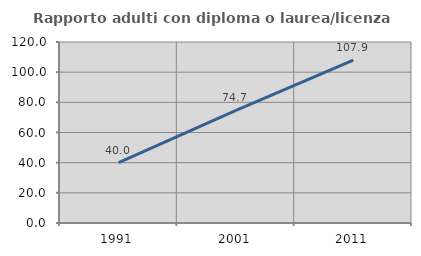
| Category | Rapporto adulti con diploma o laurea/licenza media  |
|---|---|
| 1991.0 | 40 |
| 2001.0 | 74.658 |
| 2011.0 | 107.914 |